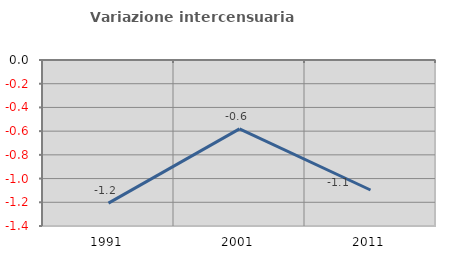
| Category | Variazione intercensuaria annua |
|---|---|
| 1991.0 | -1.207 |
| 2001.0 | -0.581 |
| 2011.0 | -1.096 |